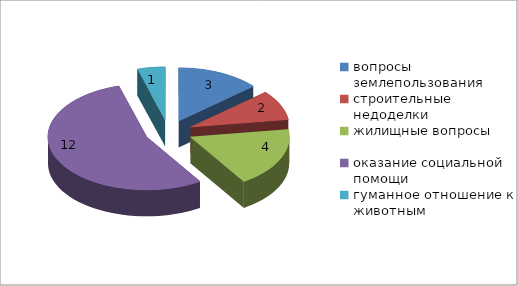
| Category | Series 0 |
|---|---|
| вопросы землепользования | 3 |
| строительные недоделки | 2 |
| жилищные вопросы | 4 |
| оказание социальной помощи | 12 |
| гуманное отношение к животным | 1 |